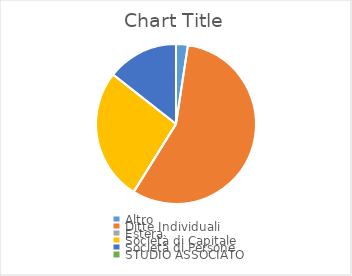
| Category | Series 0 |
|---|---|
| Altro | 130549 |
| Ditte Individuali | 3082966 |
| Estera | 423 |
| Società di Capitale | 1458974 |
| Società di Persone | 786423 |
| STUDIO ASSOCIATO | 117 |